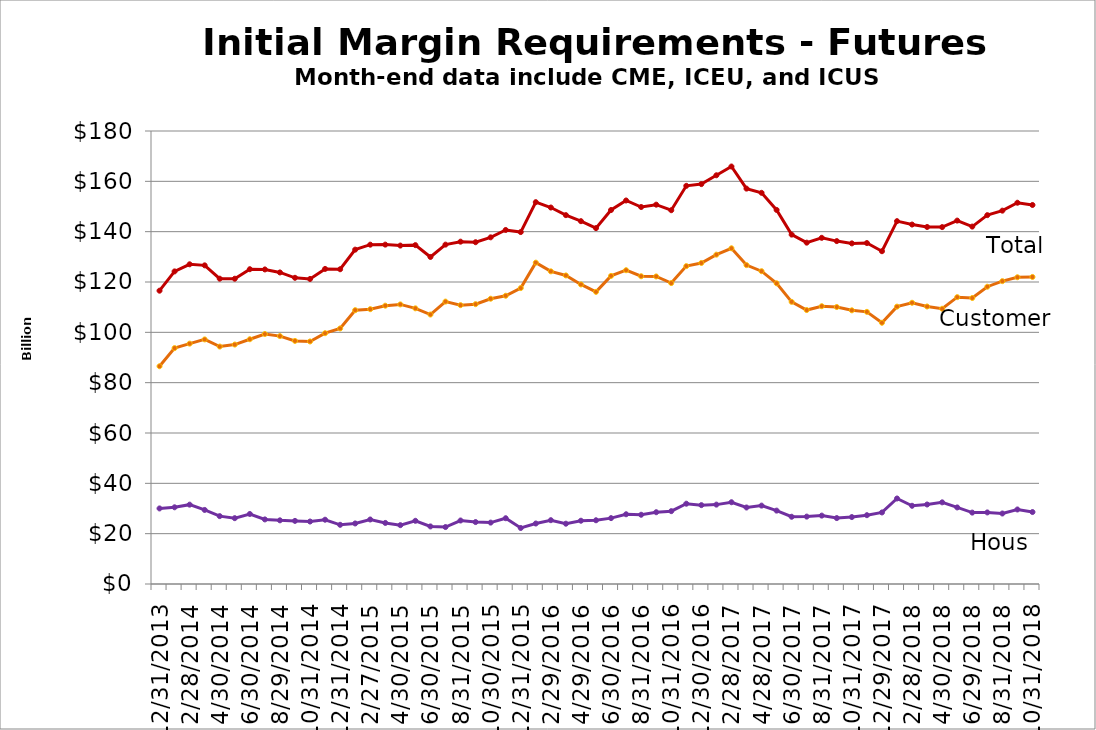
| Category | Customer | House | Total |
|---|---|---|---|
| 2013-12-31 |  |  |  |
| nan |  |  |  |
| 2014-02-28 |  |  |  |
| nan |  |  |  |
| 2014-04-30 |  |  |  |
| nan |  |  |  |
| 2014-06-30 |  |  |  |
| nan |  |  |  |
| 2014-08-29 |  |  |  |
| nan |  |  |  |
| 2014-10-31 |  |  |  |
| nan |  |  |  |
| 2014-12-31 |  |  |  |
| nan |  |  |  |
| 2015-02-27 |  |  |  |
| nan |  |  |  |
| 2015-04-30 |  |  |  |
| nan |  |  |  |
| 2015-06-30 |  |  |  |
| nan |  |  |  |
| 2015-08-31 |  |  |  |
| nan |  |  |  |
| 2015-10-30 |  |  |  |
| nan |  |  |  |
| 2015-12-31 |  |  |  |
| nan |  |  |  |
| 2016-02-29 |  |  |  |
| nan |  |  |  |
| 2016-04-29 |  |  |  |
| nan |  |  |  |
| 2016-06-30 |  |  |  |
| nan |  |  |  |
| 2016-08-31 |  |  |  |
| nan |  |  |  |
| 2016-10-31 |  |  |  |
| nan |  |  |  |
| 2016-12-30 |  |  |  |
| nan |  |  |  |
| 2017-02-28 |  |  |  |
| nan |  |  |  |
| 2017-04-28 |  |  |  |
| nan |  |  |  |
| 2017-06-30 |  |  |  |
| nan |  |  |  |
| 2017-08-31 |  |  |  |
| nan |  |  |  |
| 2017-10-31 |  |  |  |
| nan |  |  |  |
| 2017-12-29 |  |  |  |
| nan |  |  |  |
| 2018-02-28 |  |  |  |
| nan |  |  |  |
| 2018-04-30 |  |  |  |
| nan |  |  |  |
| 2018-06-29 |  |  |  |
| nan |  |  |  |
| 2018-08-31 |  |  |  |
| nan |  |  |  |
| 2018-10-31 |  |  |  |